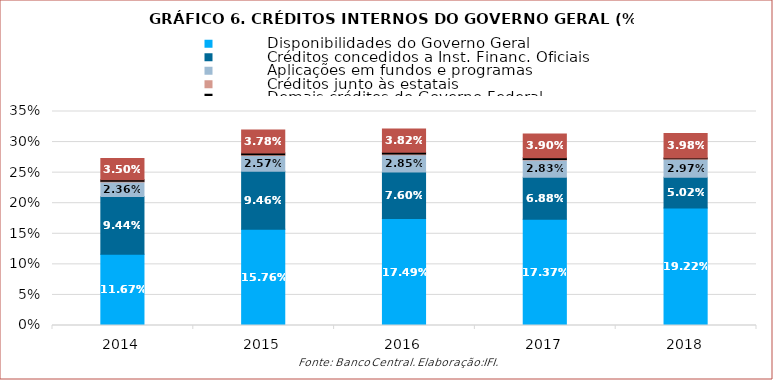
| Category |           Disponibilidades do Governo Geral |           Créditos concedidos a Inst. Financ. Oficiais |           Aplicações em fundos e programas |           Créditos junto às estatais |           Demais créditos do Governo Federal |           Recursos do FAT na rede bancária |
|---|---|---|---|---|---|---|
| 2014.0 | 0.117 | 0.094 | 0.024 | 0.001 | 0.002 | 0.035 |
| 2015.0 | 0.158 | 0.095 | 0.026 | 0.001 | 0.003 | 0.038 |
| 2016.0 | 0.175 | 0.076 | 0.028 | 0.001 | 0.003 | 0.038 |
| 2017.0 | 0.174 | 0.069 | 0.028 | 0.001 | 0.003 | 0.039 |
| 2018.0 | 0.192 | 0.05 | 0.03 | 0.001 | 0.001 | 0.04 |